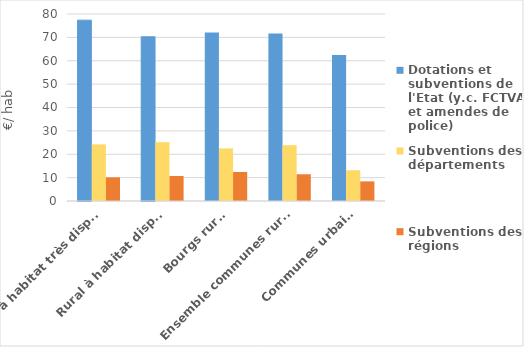
| Category | Dotations et subventions de l'Etat (y.c. FCTVA et amendes de police) | Subventions des départements | Subventions des régions |
|---|---|---|---|
| Rural à habitat très dispersé | 77.363 | 24.223 | 10.127 |
| Rural à habitat dispersé | 70.252 | 25.161 | 10.706 |
| Bourgs ruraux | 72.073 | 22.528 | 12.421 |
| Ensemble communes rurales | 71.673 | 23.881 | 11.44 |
| Communes urbaines | 62.487 | 13.173 | 8.401 |